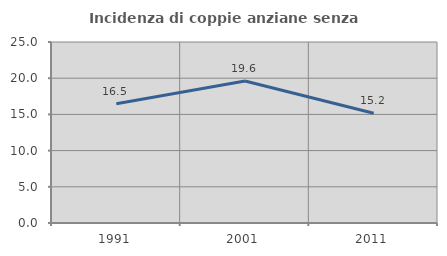
| Category | Incidenza di coppie anziane senza figli  |
|---|---|
| 1991.0 | 16.484 |
| 2001.0 | 19.608 |
| 2011.0 | 15.152 |